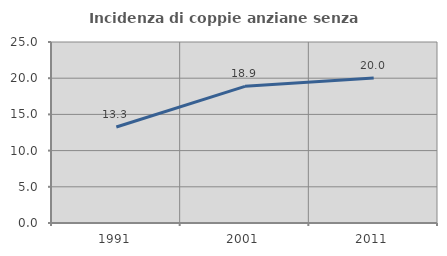
| Category | Incidenza di coppie anziane senza figli  |
|---|---|
| 1991.0 | 13.259 |
| 2001.0 | 18.872 |
| 2011.0 | 20.023 |